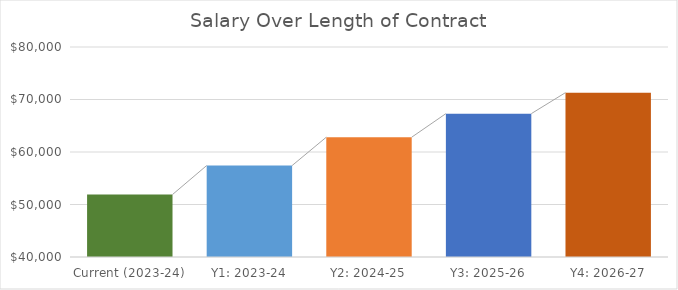
| Category | Series 0 |
|---|---|
| Current (2023-24) | 51901 |
| Y1: 2023-24 | 57422 |
| Y2: 2024-25 | 62820 |
| Y3: 2025-26 | 67308 |
| Y4: 2026-27 | 71309 |